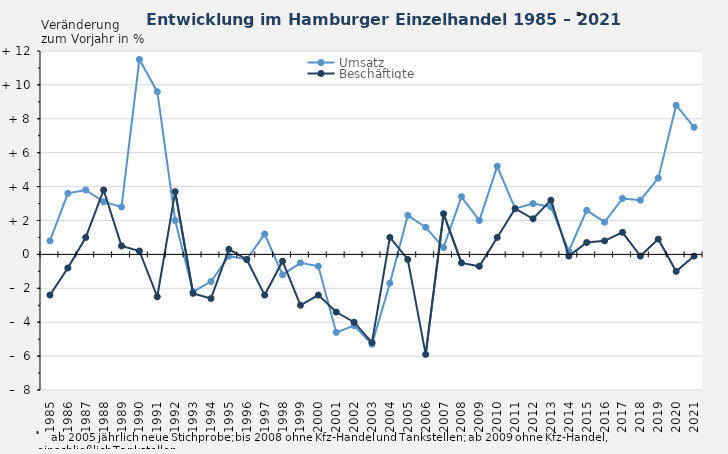
| Category | Umsatz | Beschäftigte |
|---|---|---|
| 1985.0 | 0.8 | -2.4 |
| 1986.0 | 3.6 | -0.8 |
| 1987.0 | 3.8 | 1 |
| 1988.0 | 3.1 | 3.8 |
| 1989.0 | 2.8 | 0.5 |
| 1990.0 | 11.5 | 0.2 |
| 1991.0 | 9.6 | -2.5 |
| 1992.0 | 2 | 3.7 |
| 1993.0 | -2.2 | -2.3 |
| 1994.0 | -1.6 | -2.6 |
| 1995.0 | -0.1 | 0.3 |
| 1996.0 | -0.3 | -0.3 |
| 1997.0 | 1.2 | -2.4 |
| 1998.0 | -1.2 | -0.4 |
| 1999.0 | -0.5 | -3 |
| 2000.0 | -0.7 | -2.4 |
| 2001.0 | -4.6 | -3.4 |
| 2002.0 | -4.2 | -4 |
| 2003.0 | -5.3 | -5.2 |
| 2004.0 | -1.7 | 1 |
| 2005.0 | 2.3 | -0.3 |
| 2006.0 | 1.6 | -5.9 |
| 2007.0 | 0.4 | 2.4 |
| 2008.0 | 3.4 | -0.5 |
| 2009.0 | 2 | -0.7 |
| 2010.0 | 5.2 | 1 |
| 2011.0 | 2.7 | 2.7 |
| 2012.0 | 3 | 2.1 |
| 2013.0 | 2.8 | 3.2 |
| 2014.0 | 0.2 | -0.1 |
| 2015.0 | 2.6 | 0.7 |
| 2016.0 | 1.9 | 0.8 |
| 2017.0 | 3.3 | 1.3 |
| 2018.0 | 3.2 | -0.1 |
| 2019.0 | 4.5 | 0.9 |
| 2020.0 | 8.8 | -1 |
| 2021.0 | 7.5 | -0.1 |